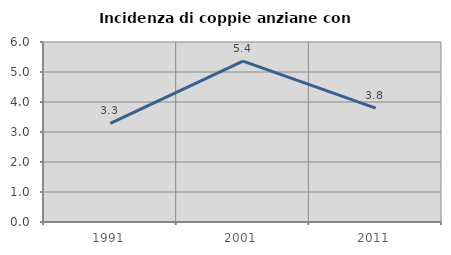
| Category | Incidenza di coppie anziane con figli |
|---|---|
| 1991.0 | 3.286 |
| 2001.0 | 5.364 |
| 2011.0 | 3.797 |